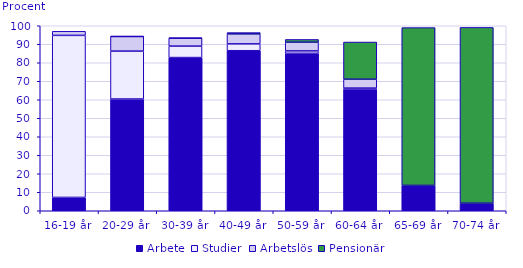
| Category | Arbete | Studier | Arbetslös | Pensionär |
|---|---|---|---|---|
| 16-19 år | 7.2 | 87.6 | 2.2 | 0 |
| 20-29 år | 60.4 | 25.9 | 7.9 | 0.1 |
| 30-39 år | 82.8 | 6.2 | 4.3 | 0.1 |
| 40-49 år | 86.5 | 3.7 | 5.4 | 0.7 |
| 50-59 år | 85.1 | 1.3 | 4.7 | 1.5 |
| 60-64 år | 65.8 | 0.5 | 4.8 | 20.1 |
| 65-69 år | 13.7 | 0 | 0 | 85.3 |
| 70-74 år | 4 | 0.1 | 0 | 95 |